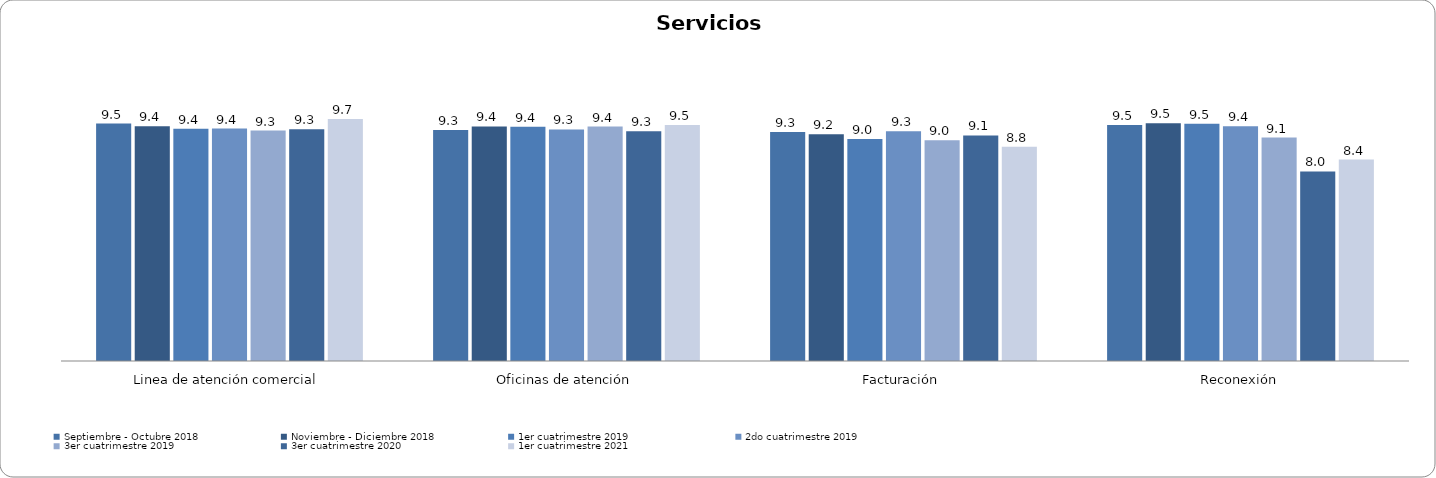
| Category | Septiembre - Octubre 2018 | Noviembre - Diciembre 2018 | 1er cuatrimestre 2019 | 2do cuatrimestre 2019 | 3er cuatrimestre 2019 | 3er cuatrimestre 2020 | 1er cuatrimestre 2021 |
|---|---|---|---|---|---|---|---|
| Linea de atención comercial | 9.525 | 9.44 | 9.364 | 9.365 | 9.302 |  | 9.667 |
| Oficinas de atención | 9.322 | 9.432 | 9.425 | 9.338 | 9.43 |  | 9.481 |
| Facturación | 9.254 | 9.185 | 9.033 | 9.279 | 8.996 |  | 8.786 |
| Reconexión | 9.48 | 9.535 | 9.516 | 9.44 | 9.08 |  | 8.386 |